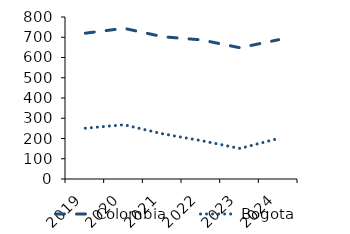
| Category | Colombia | Bogota |
|---|---|---|
| 2019.0 | 719.94 | 250.872 |
| 2020.0 | 744.104 | 267.77 |
| 2021.0 | 702.667 | 223.051 |
| 2022.0 | 686.912 | 189.387 |
| 2023.0 | 648.135 | 150.737 |
| 2024.0 | 687.908 | 200.58 |